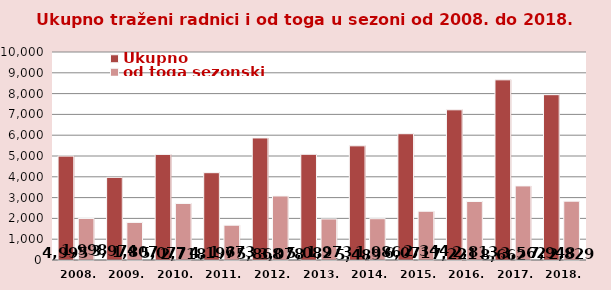
| Category | Ukupno  | od toga sezonski |
|---|---|---|
| 2008. | 4995 | 1998 |
| 2009. | 3974 | 1807 |
| 2010. | 5077 | 2718 |
| 2011. | 4197 | 1673 |
| 2012. | 5868 | 3078 |
| 2013. | 5082 | 1973 |
| 2014. | 5489 | 1986 |
| 2015. | 6071 | 2344 |
| 2016. | 7221 | 2813 |
| 2017. | 8662 | 3562 |
| 2018. | 7948 | 2829 |